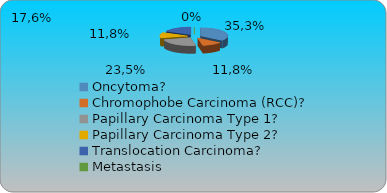
| Category | Series 0 | Series 1 | Series 2 | Series 3 |
|---|---|---|---|---|
| Oncytoma? | 0.353 |  |  |  |
| Chromophobe Carcinoma (RCC)? | 0.118 |  |  |  |
| Papillary Carcinoma Type 1?  | 0.235 |  |  |  |
| Papillary Carcinoma Type 2? | 0.118 |  |  |  |
| Translocation Carcinoma? | 0.176 |  |  |  |
| Metastasis | 0 |  |  |  |